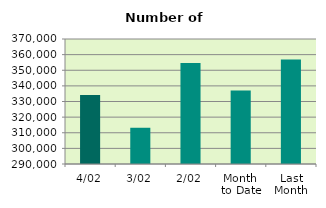
| Category | Series 0 |
|---|---|
| 4/02 | 334240 |
| 3/02 | 313194 |
| 2/02 | 354720 |
| Month 
to Date | 337049.5 |
| Last
Month | 356827.619 |